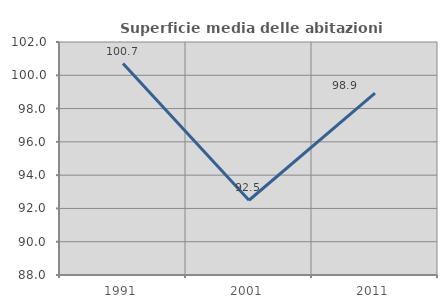
| Category | Superficie media delle abitazioni occupate |
|---|---|
| 1991.0 | 100.703 |
| 2001.0 | 92.491 |
| 2011.0 | 98.927 |